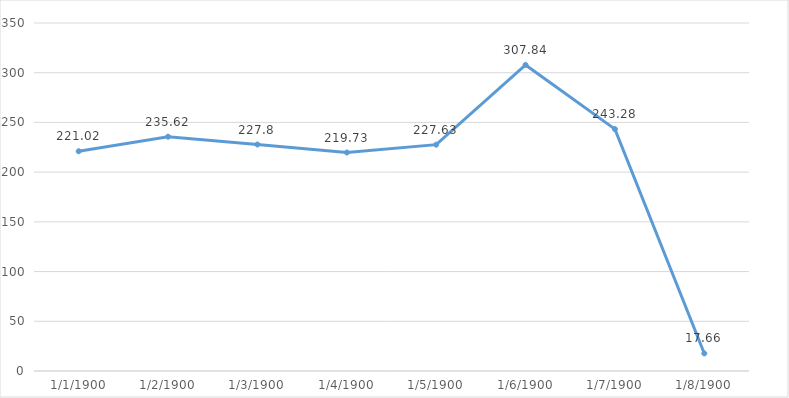
| Category | Series 0 | 2015 |
|---|---|---|
| 0 | 221.02 |  |
| 1 | 235.62 |  |
| 2 | 227.8 |  |
| 3 | 219.73 |  |
| 4 | 227.63 |  |
| 5 | 307.84 |  |
| 6 | 243.28 |  |
| 7 | 17.66 |  |